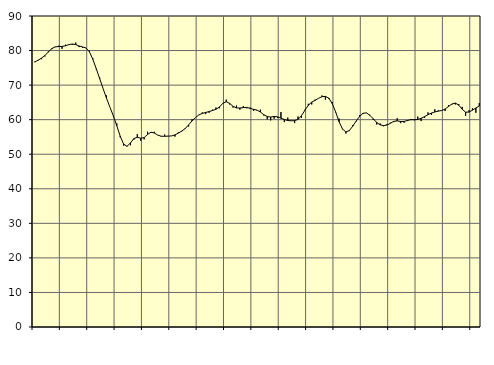
| Category | Piggar | Series 1 |
|---|---|---|
| nan | 76.8 | 76.65 |
| 87.0 | 77.3 | 77.22 |
| 87.0 | 77.5 | 77.82 |
| 87.0 | 78.3 | 78.58 |
| nan | 79.8 | 79.6 |
| 88.0 | 80.4 | 80.57 |
| 88.0 | 81 | 81.07 |
| 88.0 | 81.4 | 81.16 |
| nan | 80.5 | 81.2 |
| 89.0 | 81.7 | 81.38 |
| 89.0 | 81.8 | 81.72 |
| 89.0 | 81.7 | 81.9 |
| nan | 82.3 | 81.71 |
| 90.0 | 81 | 81.32 |
| 90.0 | 80.8 | 81.05 |
| 90.0 | 80.7 | 80.75 |
| nan | 79.9 | 79.63 |
| 91.0 | 77.8 | 77.47 |
| 91.0 | 74.5 | 74.74 |
| 91.0 | 72.2 | 71.86 |
| nan | 69 | 68.99 |
| 92.0 | 67 | 66.18 |
| 92.0 | 63.6 | 63.6 |
| 92.0 | 61 | 61.09 |
| nan | 58.9 | 58.22 |
| 93.0 | 54.9 | 55.22 |
| 93.0 | 52.5 | 52.93 |
| 93.0 | 52.4 | 52.29 |
| nan | 52.6 | 53.26 |
| 94.0 | 54.2 | 54.53 |
| 94.0 | 55.8 | 54.9 |
| 94.0 | 53.9 | 54.63 |
| nan | 54.3 | 54.81 |
| 95.0 | 56.5 | 55.71 |
| 95.0 | 56.2 | 56.37 |
| 95.0 | 56.5 | 56.13 |
| nan | 55.5 | 55.53 |
| 96.0 | 55.1 | 55.21 |
| 96.0 | 55.7 | 55.19 |
| 96.0 | 55.3 | 55.24 |
| nan | 55.3 | 55.3 |
| 97.0 | 55.1 | 55.58 |
| 97.0 | 56.3 | 56.11 |
| 97.0 | 56.6 | 56.7 |
| nan | 57.3 | 57.43 |
| 98.0 | 58 | 58.48 |
| 98.0 | 60.1 | 59.63 |
| 98.0 | 60.6 | 60.6 |
| nan | 61.4 | 61.37 |
| 99.0 | 62.1 | 61.81 |
| 99.0 | 61.6 | 62.09 |
| 99.0 | 62 | 62.34 |
| nan | 62.9 | 62.66 |
| 0.0 | 63.5 | 63 |
| 0.0 | 63.3 | 63.66 |
| 0.0 | 64.6 | 64.71 |
| nan | 65.8 | 65.19 |
| 1.0 | 64.4 | 64.7 |
| 1.0 | 63.5 | 63.85 |
| 1.0 | 64.1 | 63.4 |
| nan | 62.9 | 63.37 |
| 2.0 | 63.9 | 63.49 |
| 2.0 | 63.3 | 63.52 |
| 2.0 | 63.5 | 63.27 |
| nan | 62.6 | 62.98 |
| 3.0 | 62.7 | 62.77 |
| 3.0 | 62.9 | 62.21 |
| 3.0 | 61.2 | 61.42 |
| nan | 60.1 | 60.89 |
| 4.0 | 59.8 | 60.76 |
| 4.0 | 60.3 | 60.92 |
| 4.0 | 60.5 | 60.83 |
| nan | 62.2 | 60.43 |
| 5.0 | 59.3 | 60.04 |
| 5.0 | 60.6 | 59.75 |
| 5.0 | 59.7 | 59.67 |
| nan | 59 | 59.72 |
| 6.0 | 60.9 | 60.07 |
| 6.0 | 60.5 | 61.14 |
| 6.0 | 62.9 | 62.7 |
| nan | 64.6 | 64.15 |
| 7.0 | 64.4 | 65.08 |
| 7.0 | 65.8 | 65.6 |
| 7.0 | 66.2 | 66.18 |
| nan | 67 | 66.65 |
| 8.0 | 65.8 | 66.74 |
| 8.0 | 66 | 66.24 |
| 8.0 | 65.1 | 64.67 |
| nan | 62.1 | 62.24 |
| 9.0 | 60.3 | 59.42 |
| 9.0 | 57.2 | 57.29 |
| 9.0 | 56 | 56.44 |
| nan | 56.7 | 56.85 |
| 10.0 | 58.4 | 58.1 |
| 10.0 | 59.5 | 59.6 |
| 10.0 | 61.3 | 60.95 |
| nan | 61.7 | 61.85 |
| 11.0 | 62 | 61.95 |
| 11.0 | 61.4 | 61.28 |
| 11.0 | 59.9 | 60.24 |
| nan | 58.6 | 59.19 |
| 12.0 | 58.9 | 58.49 |
| 12.0 | 58.1 | 58.28 |
| 12.0 | 58.7 | 58.44 |
| nan | 59.1 | 58.95 |
| 13.0 | 59.3 | 59.51 |
| 13.0 | 60.4 | 59.64 |
| 13.0 | 59 | 59.47 |
| nan | 59.1 | 59.49 |
| 14.0 | 59.6 | 59.77 |
| 14.0 | 60.2 | 59.99 |
| 14.0 | 59.8 | 60 |
| nan | 60.9 | 60.05 |
| 15.0 | 59.6 | 60.39 |
| 15.0 | 60.5 | 60.89 |
| 15.0 | 62.1 | 61.44 |
| nan | 61.4 | 61.91 |
| 16.0 | 63 | 62.22 |
| 16.0 | 62.7 | 62.47 |
| 16.0 | 62.7 | 62.64 |
| nan | 62.5 | 63.08 |
| 17.0 | 64.2 | 63.82 |
| 17.0 | 64.4 | 64.53 |
| 17.0 | 64.4 | 64.81 |
| nan | 64.5 | 64.2 |
| 18.0 | 63.7 | 63.02 |
| 18.0 | 61.1 | 62.17 |
| 18.0 | 62.7 | 62.19 |
| nan | 63.3 | 62.76 |
| 19.0 | 62 | 63.38 |
| 19.0 | 64.8 | 63.96 |